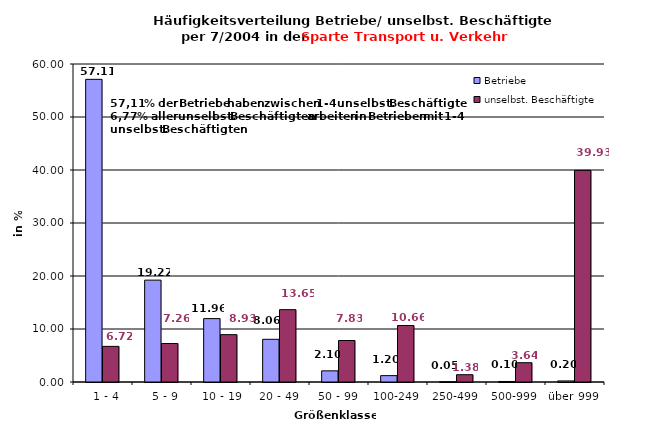
| Category | Betriebe | unselbst. Beschäftigte |
|---|---|---|
|   1 - 4 | 57.107 | 6.723 |
|   5 - 9 | 19.219 | 7.259 |
|  10 - 19 | 11.962 | 8.933 |
| 20 - 49 | 8.058 | 13.648 |
| 50 - 99 | 2.102 | 7.828 |
| 100-249 | 1.201 | 10.66 |
| 250-499 | 0.05 | 1.376 |
| 500-999 | 0.1 | 3.642 |
| über 999 | 0.2 | 39.93 |